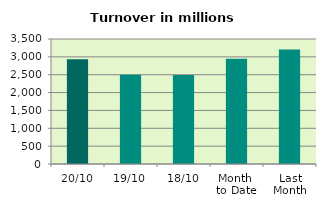
| Category | Series 0 |
|---|---|
| 20/10 | 2930.793 |
| 19/10 | 2499.859 |
| 18/10 | 2492.771 |
| Month 
to Date | 2949.371 |
| Last
Month | 3204.516 |